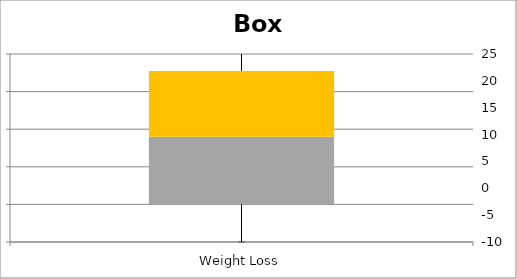
| Category | Min | Q1-Min | Med-Q1 | Q3-Med |
|---|---|---|---|---|
| Weight Loss | 0 | 5 | 9 | 8.75 |